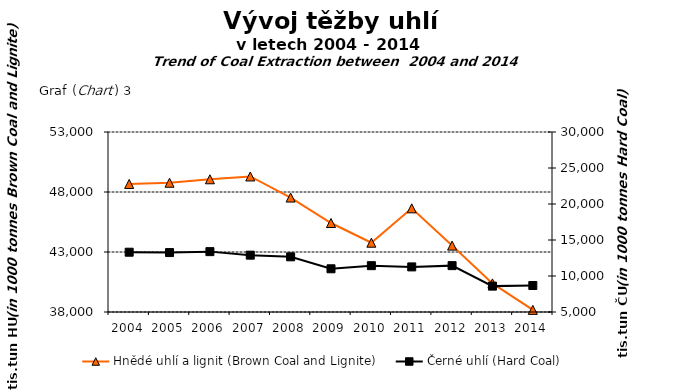
| Category | Hnědé uhlí a lignit (Brown Coal and Lignite) |
|---|---|
| 2004.0 | 48670 |
| 2005.0 | 48772 |
| 2006.0 | 49059 |
| 2007.0 | 49295 |
| 2008.0 | 47537 |
| 2009.0 | 45416 |
| 2010.0 | 43774 |
| 2011.0 | 46639 |
| 2012.0 | 43533 |
| 2013.0 | 40385 |
| 2014.0 | 38177 |